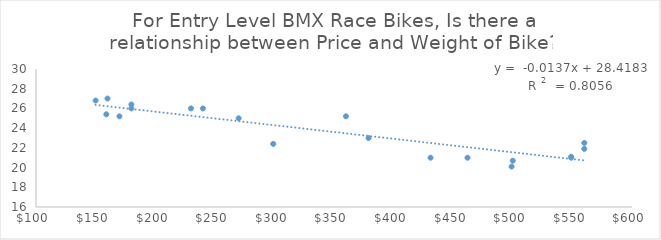
| Category | Bike Weight (pound) |
|---|---|
| 299.0 | 22.4 |
| 462.0 | 21 |
| 549.0 | 21 |
| 180.0 | 26 |
| 549.0 | 21.1 |
| 240.0 | 26 |
| 180.0 | 26.4 |
| 431.0 | 21 |
| 360.0 | 25.2 |
| 230.0 | 26 |
| 270.0 | 25 |
| 150.0 | 26.8 |
| 170.0 | 25.2 |
| 160.0 | 27 |
| 159.0 | 25.4 |
| 500.0 | 20.7 |
| 560.0 | 21.9 |
| 560.0 | 22.5 |
| 499.0 | 20.1 |
| 379.0 | 23 |